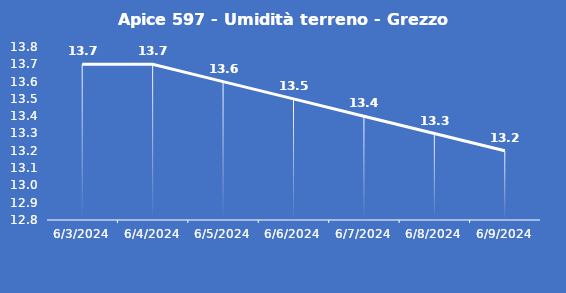
| Category | Apice 597 - Umidità terreno - Grezzo (%VWC) |
|---|---|
| 6/3/24 | 13.7 |
| 6/4/24 | 13.7 |
| 6/5/24 | 13.6 |
| 6/6/24 | 13.5 |
| 6/7/24 | 13.4 |
| 6/8/24 | 13.3 |
| 6/9/24 | 13.2 |